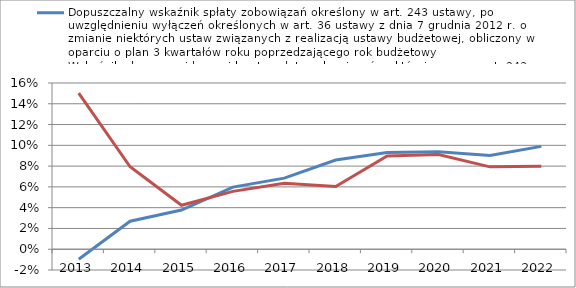
| Category | Dopuszczalny wskaźnik spłaty zobowiązań określony w art. 243 ustawy, po uwzględnieniu wyłączeń określonych w art. 36 ustawy z dnia 7 grudnia 2012 r. o zmianie niektórych ustaw związanych z realizacją ustawy budżetowej, obliczony w oparciu o plan 3 kwartał | Wskaźnik planowanej łącznej kwoty spłaty zobowiązań, o której mowa w art. 243 ust. 1 ustawy do dochodów ogółem, bez uwzględnienia zobowiązań związku współtworzonego przez jednostkę samorządu terytorialnego i bez uwzględniania wyłączeń przypadających na da |
|---|---|---|
| 2013.0 | -0.01 | 0.15 |
| 2014.0 | 0.027 | 0.079 |
| 2015.0 | 0.038 | 0.042 |
| 2016.0 | 0.06 | 0.056 |
| 2017.0 | 0.068 | 0.063 |
| 2018.0 | 0.086 | 0.06 |
| 2019.0 | 0.093 | 0.09 |
| 2020.0 | 0.094 | 0.091 |
| 2021.0 | 0.09 | 0.079 |
| 2022.0 | 0.099 | 0.08 |